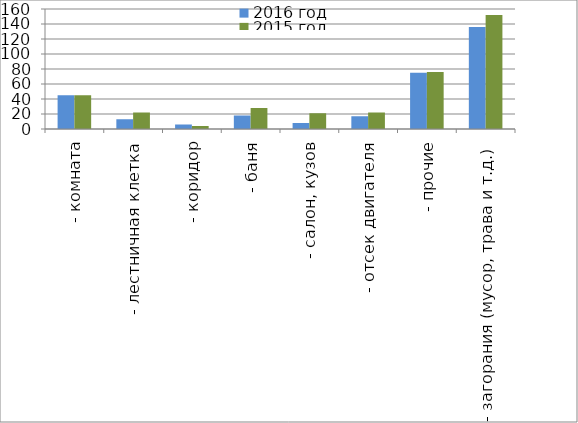
| Category | 2016 год | 2015 год |
|---|---|---|
|  - комната | 45 | 45 |
|  - лестничная клетка | 13 | 22 |
|  - коридор | 6 | 4 |
|  - баня | 18 | 28 |
|  - салон, кузов | 8 | 21 |
|  - отсек двигателя | 17 | 22 |
| - прочие | 75 | 76 |
| - загорания (мусор, трава и т.д.)  | 136 | 152 |